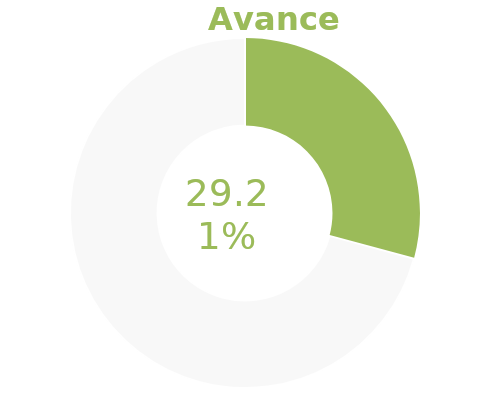
| Category | Series 0 |
|---|---|
| Acumulado 1 Trimestre | 0.292 |
| Año | -0.708 |